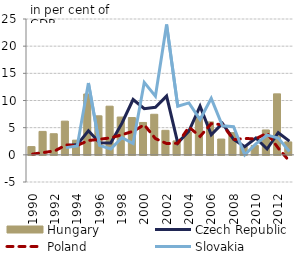
| Category | Hungary |
|---|---|
| 1990.0 | 1.517 |
| 1991.0 | 4.311 |
| 1992.0 | 3.886 |
| 1993.0 | 6.204 |
| 1994.0 | 2.7 |
| 1995.0 | 11.198 |
| 1996.0 | 7.184 |
| 1997.0 | 8.956 |
| 1998.0 | 6.955 |
| 1999.0 | 6.863 |
| 2000.0 | 5.959 |
| 2001.0 | 7.466 |
| 2002.0 | 4.51 |
| 2003.0 | 2.559 |
| 2004.0 | 4.185 |
| 2005.0 | 6.988 |
| 2006.0 | 6.058 |
| 2007.0 | 2.903 |
| 2008.0 | 4.102 |
| 2009.0 | 1.575 |
| 2010.0 | 1.727 |
| 2011.0 | 4.576 |
| 2012.0 | 11.223 |
| 2013.0 | 2.382 |